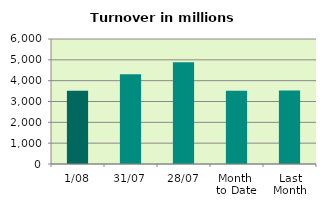
| Category | Series 0 |
|---|---|
| 1/08 | 3510.596 |
| 31/07 | 4310.188 |
| 28/07 | 4882.221 |
| Month 
to Date | 3510.596 |
| Last
Month | 3531.02 |